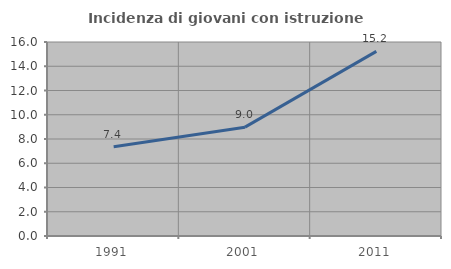
| Category | Incidenza di giovani con istruzione universitaria |
|---|---|
| 1991.0 | 7.357 |
| 2001.0 | 8.975 |
| 2011.0 | 15.226 |